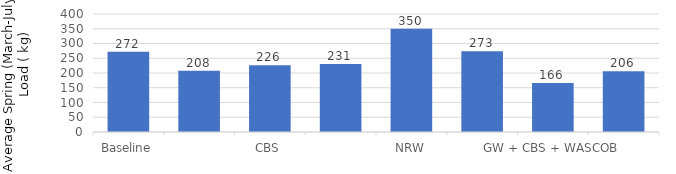
| Category | Average Spring SRP Load (kg) |
|---|---|
| Baseline | 271.88 |
| GW | 207.586 |
| CBS | 226.294 |
| WASCOB | 230.711 |
| NRW | 350.412 |
| FP | 273.465 |
| GW + CBS + WASCOB | 165.819 |
| All ACPs | 206.307 |